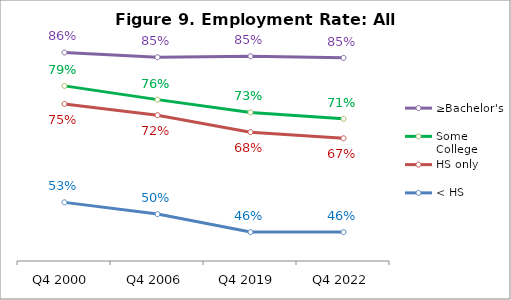
| Category | ≥Bachelor's | Some College | HS only | < HS |
|---|---|---|---|---|
| Q4 2000 | 0.861 | 0.787 | 0.748 | 0.53 |
| Q4 2006 | 0.851 | 0.757 | 0.723 | 0.504 |
| Q4 2019 | 0.853 | 0.729 | 0.685 | 0.464 |
| Q4 2022 | 0.849 | 0.715 | 0.671 | 0.464 |